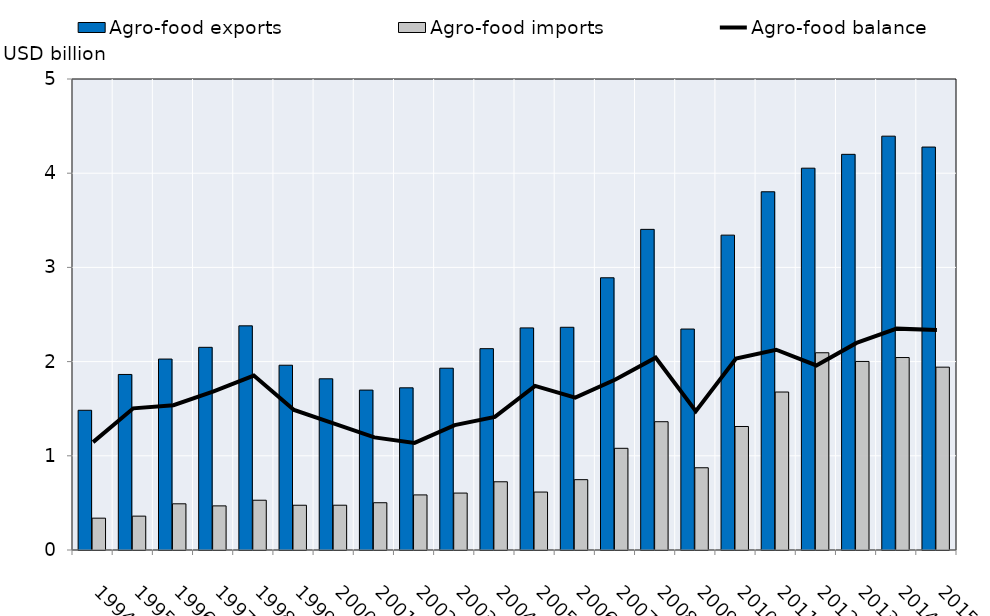
| Category | Agro-food exports | Agro-food imports |
|---|---|---|
| 1994.0 | 1.483 | 0.338 |
| 1995.0 | 1.864 | 0.36 |
| 1996.0 | 2.027 | 0.49 |
| 1997.0 | 2.152 | 0.468 |
| 1998.0 | 2.38 | 0.528 |
| 1999.0 | 1.961 | 0.475 |
| 2000.0 | 1.817 | 0.475 |
| 2001.0 | 1.698 | 0.502 |
| 2002.0 | 1.722 | 0.585 |
| 2003.0 | 1.93 | 0.604 |
| 2004.0 | 2.137 | 0.724 |
| 2005.0 | 2.358 | 0.615 |
| 2006.0 | 2.364 | 0.747 |
| 2007.0 | 2.89 | 1.08 |
| 2008.0 | 3.404 | 1.362 |
| 2009.0 | 2.346 | 0.873 |
| 2010.0 | 3.343 | 1.311 |
| 2011.0 | 3.803 | 1.677 |
| 2012.0 | 4.053 | 2.094 |
| 2013.0 | 4.2 | 2.002 |
| 2014.0 | 4.393 | 2.043 |
| 2015.0 | 4.278 | 1.941 |